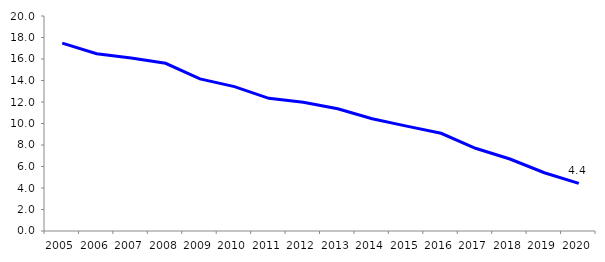
| Category | Total en retard |
|---|---|
| 2005 | 17.473 |
| 2006 | 16.488 |
| 2007 | 16.084 |
| 2008 | 15.601 |
| 2009 | 14.153 |
| 2010 | 13.43 |
| 2011 | 12.341 |
| 2012 | 11.973 |
| 2013 | 11.371 |
| 2014 | 10.448 |
| 2015 | 9.754 |
| 2016 | 9.088 |
| 2017 | 7.697 |
| 2018 | 6.696 |
| 2019 | 5.418 |
| 2020 | 4.432 |